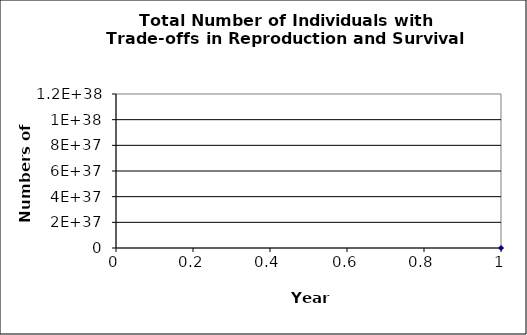
| Category | Series 0 |
|---|---|
| 0 | 20 |
| 1 | 55 |
| 2 | 302.5 |
| 3 | 1663.75 |
| 4 | 9150.625 |
| 5 | 50328.438 |
| 6 | 276806.406 |
| 7 | 1522435.234 |
| 8 | 8373393.789 |
| 9 | 46053665.84 |
| 10 | 253295162.119 |
| 11 | 1393123391.655 |
| 12 | 7662178654.104 |
| 13 | 42141982597.572 |
| 14 | 231780904286.646 |
| 15 | 1274794973576.554 |
| 16 | 7011372354671.045 |
| 17 | 38562547950690.75 |
| 18 | 212094013728799.12 |
| 19 | 1166517075508395.2 |
| 20 | 6415843915296174 |
| 21 | 35287141534128956 |
| 22 | 194079278437709248 |
| 23 | 1067436031407400832 |
| 24 | 5870898172740704256 |
| 25 | 32289939950073872384 |
| 26 | 177594669725406298112 |
| 27 | 976770683489734623232 |
| 28 | 5372238759193540034560 |
| 29 | 29547313175564472287232 |
| 30 | 162510222465604610162688 |
| 31 | 893806223560825389449216 |
| 32 | 4915934229584539306426368 |
| 33 | 27037638262714966185345024 |
| 34 | 148707010444932311871913984 |
| 35 | 817888557447127680935788544 |
| 36 | 4498387065959202451305267200 |
| 37 | 24741128862775611558033620992 |
| 38 | 136076208745265861370161659904 |
| 39 | 748419148098962219943703085056 |
| 40 | 4116305314544292350427855323136 |
| 41 | 22639679229993609334728087830528 |
| 42 | 124518235764964851341004483067904 |
| 43 | 684850296707306691382723911614464 |
| 44 | 3766676631890186730547387475951616 |
| 45 | 20716721475396027306241007269445632 |
| 46 | 113941968114678144419718016947716096 |
| 47 | 626680824630729775861705019502886912 |
| 48 | 3446744535469013693452401312427671552 |
| 49 | 18957094945079575904284017577057845248 |
| 50 | 104264022197937676918295062413108576256 |